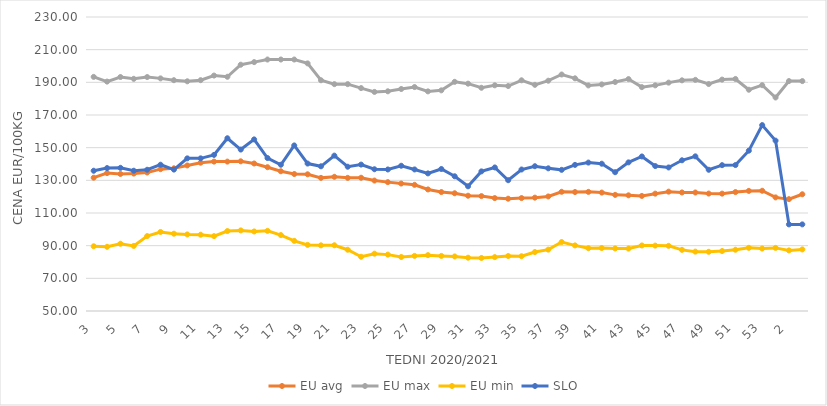
| Category | EU avg | EU max | EU min | SLO |
|---|---|---|---|---|
| 3.0 | 131.617 | 193.34 | 89.63 | 135.87 |
| 4.0 | 134.43 | 190.45 | 89.3 | 137.5 |
| 5.0 | 133.898 | 193.25 | 91.17 | 137.66 |
| 6.0 | 134.136 | 192.15 | 89.835 | 135.88 |
| 7.0 | 134.799 | 193.24 | 95.88 | 136.47 |
| 8.0 | 136.846 | 192.42 | 98.381 | 139.56 |
| 9.0 | 137.361 | 191.31 | 97.323 | 136.58 |
| 10.0 | 139.118 | 190.63 | 96.874 | 143.45 |
| 11.0 | 140.789 | 191.32 | 96.705 | 143.45 |
| 12.0 | 141.467 | 194.15 | 95.845 | 145.57 |
| 13.0 | 141.466 | 193.4 | 98.945 | 155.76 |
| 14.0 | 141.645 | 200.79 | 99.347 | 148.84 |
| 15.0 | 140.306 | 202.38 | 98.696 | 155.07 |
| 16.0 | 138.046 | 203.97 | 99.065 | 143.65 |
| 17.0 | 135.556 | 203.97 | 96.499 | 139.55 |
| 18.0 | 133.857 | 203.97 | 92.931 | 151.36 |
| 19.0 | 133.702 | 201.59 | 90.48 | 140.27 |
| 20.0 | 131.51 | 191.27 | 90.199 | 138.59 |
| 21.0 | 132.157 | 188.89 | 90.255 | 145.12 |
| 22.0 | 131.509 | 188.89 | 87.513 | 138.33 |
| 23.0 | 131.578 | 186.47 | 83.199 | 139.64 |
| 24.0 | 129.861 | 184.13 | 85.09 | 136.79 |
| 25.0 | 128.899 | 184.51 | 84.52 | 136.65 |
| 26.0 | 128.034 | 185.91 | 83.06 | 138.92 |
| 27.0 | 127.242 | 187.11 | 83.73 | 136.67 |
| 28.0 | 124.426 | 184.46 | 84.2 | 134.25 |
| 29.0 | 122.822 | 185.09 | 83.72 | 136.94 |
| 30.0 | 122.086 | 190.31 | 83.4 | 132.48 |
| 31.0 | 120.581 | 189.19 | 82.63 | 126.34 |
| 32.0 | 120.341 | 186.67 | 82.46 | 135.48 |
| 33.0 | 119.127 | 188.18 | 82.99 | 137.89 |
| 34.0 | 118.75 | 187.74 | 83.66 | 130.07 |
| 35.0 | 119.136 | 191.25 | 83.53 | 136.63 |
| 36.0 | 119.398 | 188.47 | 86.09 | 138.64 |
| 37.0 | 120.135 | 190.99 | 87.57 | 137.35 |
| 38.0 | 122.982 | 194.8 | 92.21 | 136.42 |
| 39.0 | 122.832 | 192.45 | 90.16 | 139.46 |
| 40.0 | 122.936 | 188.11 | 88.45 | 140.87 |
| 41.0 | 122.507 | 188.73 | 88.54 | 140.18 |
| 42.0 | 121.098 | 190.2 | 88.3 | 134.98 |
| 43.0 | 120.822 | 191.99 | 88.22 | 141 |
| 44.0 | 120.448 | 187.06 | 90.13 | 144.61 |
| 45.0 | 121.843 | 188.15 | 90.04 | 138.73 |
| 46.0 | 123.07 | 189.82 | 89.89 | 137.88 |
| 47.0 | 122.58 | 191.22 | 87.43 | 142.27 |
| 48.0 | 122.553 | 191.52 | 86.35 | 144.69 |
| 49.0 | 121.893 | 188.97 | 86.24 | 136.47 |
| 50.0 | 121.851 | 191.67 | 86.72 | 139.29 |
| 51.0 | 122.8 | 192.06 | 87.5 | 139.35 |
| 52.0 | 123.52 | 185.468 | 88.67 | 148.16 |
| 53.0 | 123.611 | 188.25 | 88.23 | 163.81 |
| 1.0 | 119.553 | 180.72 | 88.64 | 154.31 |
| 2.0 | 118.487 | 190.77 | 87.1 | 103.02 |
| 3.0 | 121.47 | 190.76 | 87.7 | 103.03 |